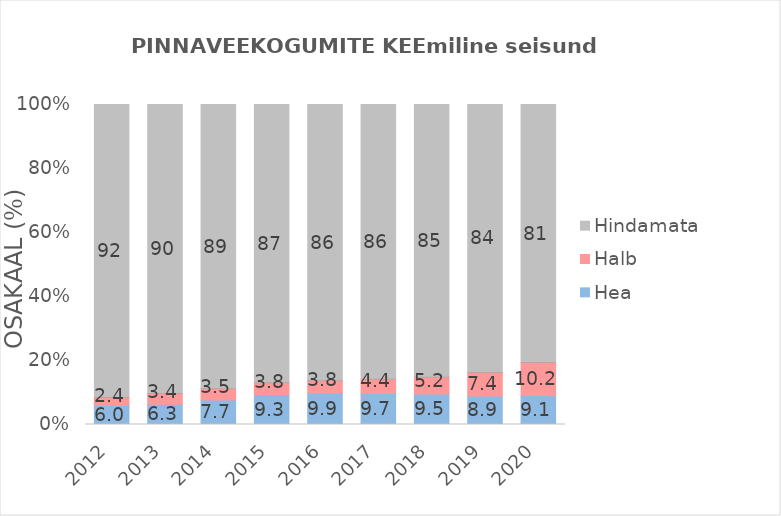
| Category | Hea  | Halb | Hindamata |
|---|---|---|---|
| 2012.0 | 6.048 | 2.419 | 91.532 |
| 2013.0 | 6.317 | 3.36 | 90.323 |
| 2014.0 | 7.661 | 3.495 | 88.844 |
| 2015.0 | 9.274 | 3.763 | 86.962 |
| 2016.0 | 9.946 | 3.763 | 86.29 |
| 2017.0 | 9.677 | 4.435 | 85.887 |
| 2018.0 | 9.543 | 5.242 | 85.215 |
| 2019.0 | 8.871 | 7.392 | 83.737 |
| 2020.0 | 9.14 | 10.215 | 80.645 |